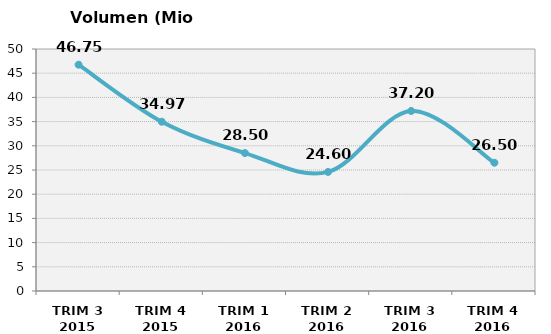
| Category | Volumen (Mio consumiciones) |
|---|---|
| TRIM 3 2015 | 46.753 |
| TRIM 4 2015 | 34.971 |
| TRIM 1 2016 | 28.5 |
| TRIM 2 2016 | 24.6 |
| TRIM 3 2016 | 37.2 |
| TRIM 4 2016 | 26.5 |